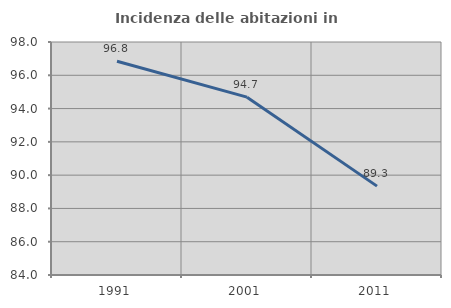
| Category | Incidenza delle abitazioni in proprietà  |
|---|---|
| 1991.0 | 96.847 |
| 2001.0 | 94.686 |
| 2011.0 | 89.34 |